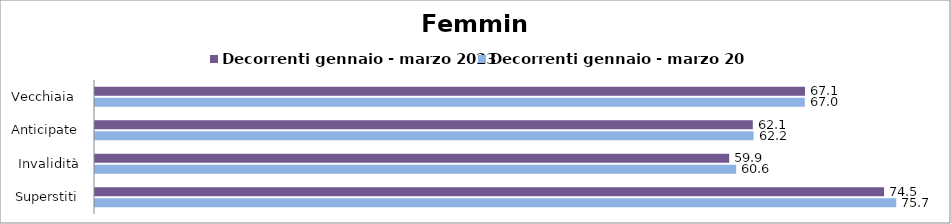
| Category | Decorrenti gennaio - marzo 2023 | Decorrenti gennaio - marzo 2024 |
|---|---|---|
| Vecchiaia  | 67.06 | 67.04 |
| Anticipate | 62.13 | 62.2 |
| Invalidità | 59.9 | 60.56 |
| Superstiti | 74.53 | 75.68 |